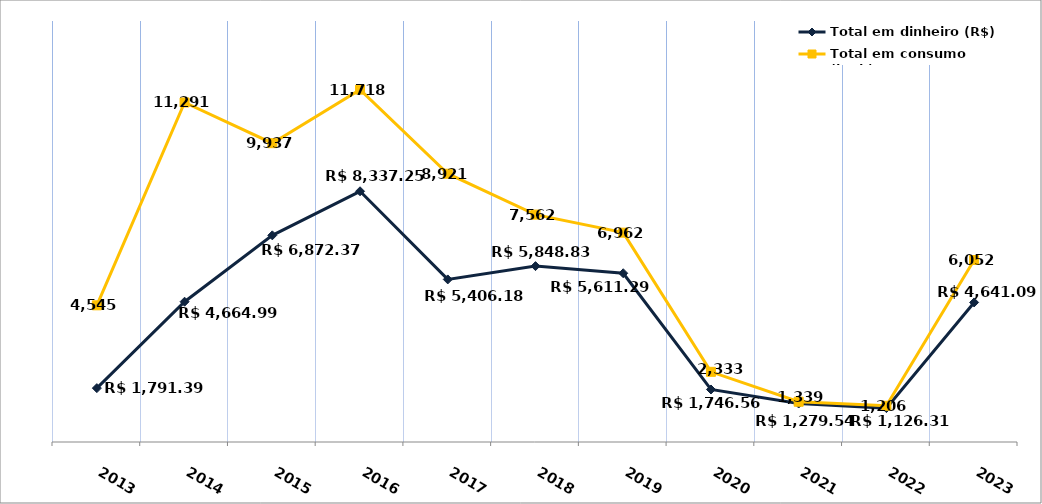
| Category | Total em dinheiro (R$) |
|---|---|
| 2013.0 | 1791.39 |
| 2014.0 | 4664.99 |
| 2015.0 | 6872.37 |
| 2016.0 | 8337.25 |
| 2017.0 | 5406.18 |
| 2018.0 | 5848.83 |
| 2019.0 | 5611.29 |
| 2020.0 | 1746.56 |
| 2021.0 | 1279.54 |
| 2022.0 | 1126.31 |
| 2023.0 | 4641.09 |